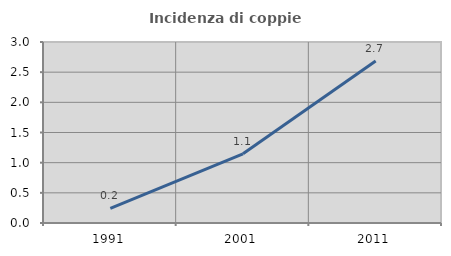
| Category | Incidenza di coppie miste |
|---|---|
| 1991.0 | 0.244 |
| 2001.0 | 1.147 |
| 2011.0 | 2.687 |